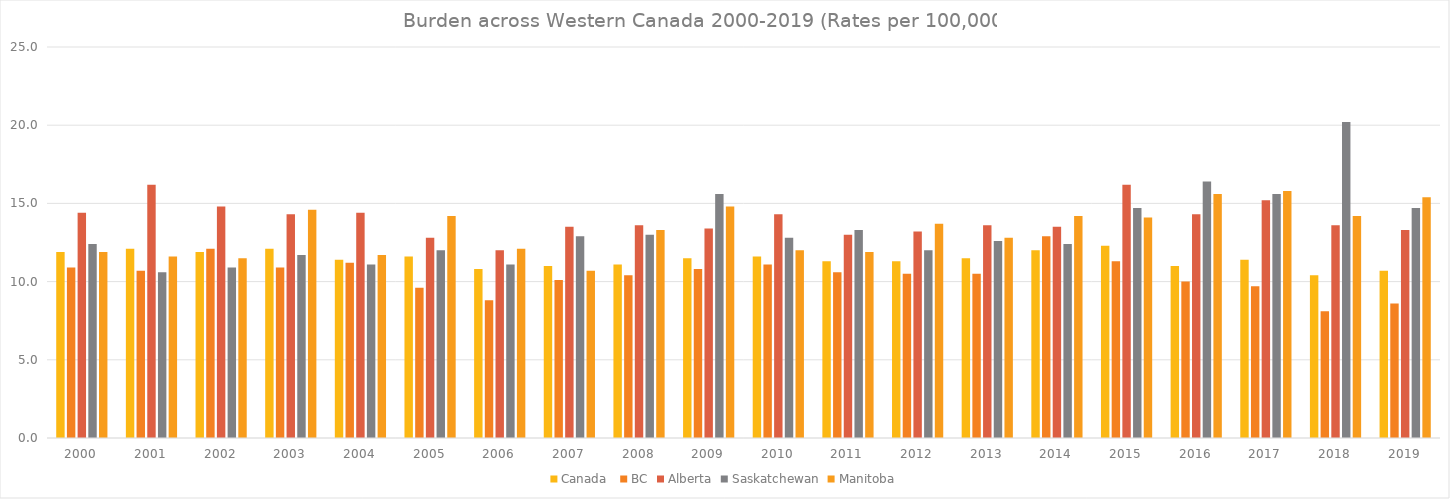
| Category | Canada  | BC | Alberta | Saskatchewan | Manitoba |
|---|---|---|---|---|---|
| 2000.0 | 11.9 | 10.9 | 14.4 | 12.4 | 11.9 |
| 2001.0 | 12.1 | 10.7 | 16.2 | 10.6 | 11.6 |
| 2002.0 | 11.9 | 12.1 | 14.8 | 10.9 | 11.5 |
| 2003.0 | 12.1 | 10.9 | 14.3 | 11.7 | 14.6 |
| 2004.0 | 11.4 | 11.2 | 14.4 | 11.1 | 11.7 |
| 2005.0 | 11.6 | 9.6 | 12.8 | 12 | 14.2 |
| 2006.0 | 10.8 | 8.8 | 12 | 11.1 | 12.1 |
| 2007.0 | 11 | 10.1 | 13.5 | 12.9 | 10.7 |
| 2008.0 | 11.1 | 10.4 | 13.6 | 13 | 13.3 |
| 2009.0 | 11.5 | 10.8 | 13.4 | 15.6 | 14.8 |
| 2010.0 | 11.6 | 11.1 | 14.3 | 12.8 | 12 |
| 2011.0 | 11.3 | 10.6 | 13 | 13.3 | 11.9 |
| 2012.0 | 11.3 | 10.5 | 13.2 | 12 | 13.7 |
| 2013.0 | 11.5 | 10.5 | 13.6 | 12.6 | 12.8 |
| 2014.0 | 12 | 12.9 | 13.5 | 12.4 | 14.2 |
| 2015.0 | 12.3 | 11.3 | 16.2 | 14.7 | 14.1 |
| 2016.0 | 11 | 10 | 14.3 | 16.4 | 15.6 |
| 2017.0 | 11.4 | 9.7 | 15.2 | 15.6 | 15.8 |
| 2018.0 | 10.4 | 8.1 | 13.6 | 20.2 | 14.2 |
| 2019.0 | 10.7 | 8.6 | 13.3 | 14.7 | 15.4 |